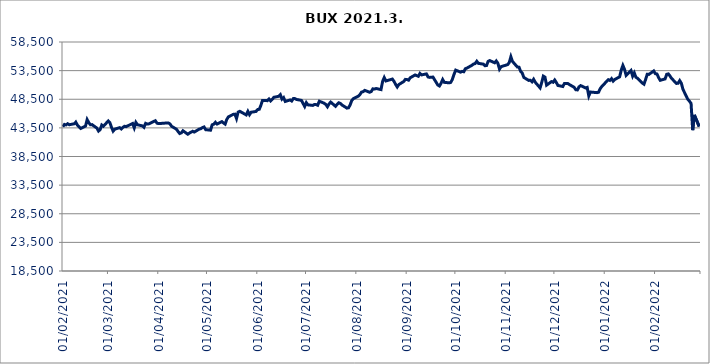
| Category | BUX |
|---|---|
| 01/02/2021 | 43703.87 |
| 02/02/2021 | 44101.05 |
| 03/02/2021 | 44016.29 |
| 04/02/2021 | 44226.34 |
| 05/02/2021 | 44045.26 |
| 08/02/2021 | 44215.97 |
| 09/02/2021 | 44511.16 |
| 10/02/2021 | 43950.78 |
| 11/02/2021 | 43676.69 |
| 12/02/2021 | 43389.33 |
| 15/02/2021 | 43823.57 |
| 16/02/2021 | 44941.65 |
| 17/02/2021 | 44416.15 |
| 18/02/2021 | 44046.56 |
| 19/02/2021 | 44069.31 |
| 22/02/2021 | 43457.15 |
| 23/02/2021 | 42945.11 |
| 24/02/2021 | 43183.45 |
| 25/02/2021 | 43999.47 |
| 26/02/2021 | 43790.17 |
| 01/03/2021 | 44710.25 |
| 02/03/2021 | 44402.33 |
| 03/03/2021 | 43595.22 |
| 04/03/2021 | 42932.61 |
| 05/03/2021 | 43269 |
| 08/03/2021 | 43540.36 |
| 09/03/2021 | 43312.66 |
| 10/03/2021 | 43579.39 |
| 11/03/2021 | 43784.89 |
| 12/03/2021 | 43711.84 |
| 16/03/2021 | 44268.77 |
| 17/03/2021 | 43504.47 |
| 18/03/2021 | 44465.75 |
| 19/03/2021 | 44042.12 |
| 22/03/2021 | 43851.96 |
| 23/03/2021 | 43603.02 |
| 24/03/2021 | 44290.24 |
| 25/03/2021 | 44168.81 |
| 26/03/2021 | 44201.25 |
| 29/03/2021 | 44617.73 |
| 30/03/2021 | 44746.76 |
| 31/03/2021 | 44326.18 |
| 01/04/2021 | 44242.93 |
| 06/04/2021 | 44357.86 |
| 07/04/2021 | 44357.64 |
| 08/04/2021 | 44194.16 |
| 09/04/2021 | 43775.41 |
| 12/04/2021 | 43267.25 |
| 13/04/2021 | 42865.63 |
| 14/04/2021 | 42514.94 |
| 15/04/2021 | 42626.71 |
| 16/04/2021 | 42997.61 |
| 19/04/2021 | 42388.09 |
| 20/04/2021 | 42597.26 |
| 21/04/2021 | 42753.6 |
| 22/04/2021 | 42906.48 |
| 23/04/2021 | 42772.95 |
| 26/04/2021 | 43281.61 |
| 27/04/2021 | 43357.19 |
| 28/04/2021 | 43549.43 |
| 29/04/2021 | 43665.42 |
| 30/04/2021 | 43183.2 |
| 03/05/2021 | 43093.89 |
| 04/05/2021 | 44036.18 |
| 05/05/2021 | 44142.7 |
| 06/05/2021 | 44472.71 |
| 07/05/2021 | 44164.37 |
| 10/05/2021 | 44587.59 |
| 11/05/2021 | 44350.67 |
| 12/05/2021 | 44160.71 |
| 13/05/2021 | 44974.08 |
| 14/05/2021 | 45429.12 |
| 17/05/2021 | 45862.01 |
| 18/05/2021 | 45891.45 |
| 19/05/2021 | 45128.56 |
| 20/05/2021 | 46261.37 |
| 21/05/2021 | 46396.87 |
| 25/05/2021 | 45765.15 |
| 26/05/2021 | 46379.32 |
| 27/05/2021 | 45802.61 |
| 28/05/2021 | 46233.29 |
| 31/05/2021 | 46371.02 |
| 01/06/2021 | 46699.74 |
| 02/06/2021 | 46736.89 |
| 03/06/2021 | 47422.77 |
| 04/06/2021 | 48282.14 |
| 07/06/2021 | 48255.9 |
| 08/06/2021 | 48546.45 |
| 09/06/2021 | 48206.56 |
| 10/06/2021 | 48475.07 |
| 11/06/2021 | 48845.84 |
| 14/06/2021 | 49015.24 |
| 15/06/2021 | 49299.48 |
| 16/06/2021 | 48525.74 |
| 17/06/2021 | 48795.68 |
| 18/06/2021 | 48117.72 |
| 21/06/2021 | 48379.62 |
| 22/06/2021 | 48193.16 |
| 23/06/2021 | 48624.32 |
| 24/06/2021 | 48610.4 |
| 25/06/2021 | 48461.47 |
| 28/06/2021 | 48301.62 |
| 29/06/2021 | 47759.62 |
| 30/06/2021 | 47238.09 |
| 01/07/2021 | 47908.81 |
| 02/07/2021 | 47520.42 |
| 05/07/2021 | 47423.61 |
| 06/07/2021 | 47592.47 |
| 07/07/2021 | 47574.37 |
| 08/07/2021 | 47452.73 |
| 09/07/2021 | 48157.57 |
| 12/07/2021 | 47804.26 |
| 13/07/2021 | 47592.34 |
| 14/07/2021 | 47184.6 |
| 15/07/2021 | 47677.82 |
| 16/07/2021 | 48003.25 |
| 19/07/2021 | 47268.49 |
| 20/07/2021 | 47622.68 |
| 21/07/2021 | 47882.56 |
| 22/07/2021 | 47756.88 |
| 23/07/2021 | 47491.69 |
| 26/07/2021 | 46952.76 |
| 27/07/2021 | 47002.77 |
| 28/07/2021 | 47527.53 |
| 29/07/2021 | 48286.06 |
| 30/07/2021 | 48610.95 |
| 02/08/2021 | 49041.18 |
| 03/08/2021 | 49315.61 |
| 04/08/2021 | 49745.57 |
| 05/08/2021 | 49830.28 |
| 06/08/2021 | 50050.88 |
| 09/08/2021 | 49721.84 |
| 10/08/2021 | 49849.71 |
| 11/08/2021 | 50317.1 |
| 12/08/2021 | 50289.64 |
| 13/08/2021 | 50378.65 |
| 16/08/2021 | 50183.56 |
| 17/08/2021 | 51626.62 |
| 18/08/2021 | 52288.87 |
| 19/08/2021 | 51696.55 |
| 23/08/2021 | 52023.19 |
| 24/08/2021 | 51633.85 |
| 25/08/2021 | 51093.8 |
| 26/08/2021 | 50640.51 |
| 27/08/2021 | 51068.8 |
| 30/08/2021 | 51602.58 |
| 31/08/2021 | 51969.67 |
| 01/09/2021 | 51946.96 |
| 02/09/2021 | 51830.24 |
| 03/09/2021 | 52255.11 |
| 06/09/2021 | 52743.09 |
| 07/09/2021 | 52623.96 |
| 08/09/2021 | 52514.94 |
| 09/09/2021 | 53015.67 |
| 10/09/2021 | 52755.68 |
| 13/09/2021 | 52922.72 |
| 14/09/2021 | 52392.39 |
| 15/09/2021 | 52317.91 |
| 16/09/2021 | 52331.31 |
| 17/09/2021 | 52376.91 |
| 20/09/2021 | 50982.15 |
| 21/09/2021 | 50815.56 |
| 22/09/2021 | 51298.14 |
| 23/09/2021 | 51946.86 |
| 24/09/2021 | 51453.71 |
| 27/09/2021 | 51365.99 |
| 28/09/2021 | 51446.2 |
| 29/09/2021 | 52004.6 |
| 30/09/2021 | 52854.65 |
| 01/10/2021 | 53589.8 |
| 04/10/2021 | 53234.94 |
| 05/10/2021 | 53369.78 |
| 06/10/2021 | 53305.16 |
| 07/10/2021 | 53844.59 |
| 08/10/2021 | 53955.85 |
| 11/10/2021 | 54432.56 |
| 12/10/2021 | 54648.43 |
| 13/10/2021 | 54733.73 |
| 14/10/2021 | 55136 |
| 15/10/2021 | 54764.34 |
| 18/10/2021 | 54637.92 |
| 19/10/2021 | 54356.89 |
| 20/10/2021 | 54393.63 |
| 21/10/2021 | 55121.35 |
| 22/10/2021 | 55254.39 |
| 25/10/2021 | 54867.62 |
| 26/10/2021 | 55191.91 |
| 27/10/2021 | 54780.65 |
| 28/10/2021 | 53766.44 |
| 29/10/2021 | 54197.71 |
| 02/11/2021 | 54548.9 |
| 03/11/2021 | 54914.54 |
| 04/11/2021 | 55925.58 |
| 05/11/2021 | 55099.88 |
| 08/11/2021 | 54132.14 |
| 09/11/2021 | 54099.27 |
| 10/11/2021 | 53389.23 |
| 11/11/2021 | 53073.34 |
| 12/11/2021 | 52306.67 |
| 15/11/2021 | 51789.8 |
| 16/11/2021 | 51818.41 |
| 17/11/2021 | 51549.36 |
| 18/11/2021 | 51992.3 |
| 19/11/2021 | 51472.91 |
| 22/11/2021 | 50483.99 |
| 23/11/2021 | 51424.26 |
| 24/11/2021 | 52535.97 |
| 25/11/2021 | 52364.37 |
| 26/11/2021 | 50961.25 |
| 29/11/2021 | 51579.66 |
| 30/11/2021 | 51464.6 |
| 01/12/2021 | 51860.19 |
| 02/12/2021 | 51420.71 |
| 03/12/2021 | 50904.91 |
| 06/12/2021 | 50723.42 |
| 07/12/2021 | 51268.65 |
| 08/12/2021 | 51261.63 |
| 09/12/2021 | 51262.82 |
| 10/12/2021 | 51076.61 |
| 13/12/2021 | 50581.29 |
| 14/12/2021 | 50153 |
| 15/12/2021 | 50131.61 |
| 16/12/2021 | 50672.47 |
| 17/12/2021 | 50887.3 |
| 20/12/2021 | 50471.14 |
| 21/12/2021 | 50571.05 |
| 22/12/2021 | 49083.56 |
| 23/12/2021 | 49762.24 |
| 27/12/2021 | 49654.12 |
| 28/12/2021 | 49718.15 |
| 29/12/2021 | 50342.57 |
| 30/12/2021 | 50720.71 |
| 03/01/2022 | 51924.62 |
| 04/01/2022 | 51785.29 |
| 05/01/2022 | 52097.34 |
| 06/01/2022 | 51668.96 |
| 07/01/2022 | 51956.74 |
| 10/01/2022 | 52416.01 |
| 11/01/2022 | 53599.36 |
| 12/01/2022 | 54405.84 |
| 13/01/2022 | 53736.16 |
| 14/01/2022 | 52675.9 |
| 17/01/2022 | 53509.01 |
| 18/01/2022 | 52545.64 |
| 19/01/2022 | 53121.9 |
| 20/01/2022 | 52349.65 |
| 21/01/2022 | 52169.8 |
| 24/01/2022 | 51325.34 |
| 25/01/2022 | 51134.63 |
| 26/01/2022 | 51958.75 |
| 27/01/2022 | 52866.56 |
| 28/01/2022 | 52838.78 |
| 31/01/2022 | 53442.24 |
| 01/02/2022 | 52959.27 |
| 02/02/2022 | 52910.14 |
| 03/02/2022 | 52284.64 |
| 04/02/2022 | 51806.4 |
| 07/02/2022 | 52054.67 |
| 08/02/2022 | 52861.48 |
| 09/02/2022 | 52930.3 |
| 10/02/2022 | 52566.76 |
| 11/02/2022 | 52141.58 |
| 14/02/2022 | 51262 |
| 15/02/2022 | 51295.36 |
| 16/02/2022 | 51756.19 |
| 17/02/2022 | 51305.38 |
| 18/02/2022 | 50237.2 |
| 21/02/2022 | 48470.72 |
| 22/02/2022 | 48177.46 |
| 23/02/2022 | 47762.14 |
| 24/02/2022 | 43102.34 |
| 25/02/2022 | 45769.16 |
| 28/02/2022 | 43731.25 |